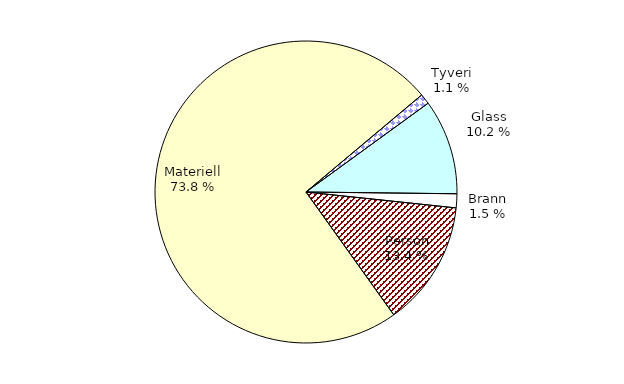
| Category | Series 0 |
|---|---|
| Tyveri | 46.034 |
| Glass | 424.055 |
| Brann | 62.206 |
| Person | 559.434 |
| Materiell | 3069.113 |